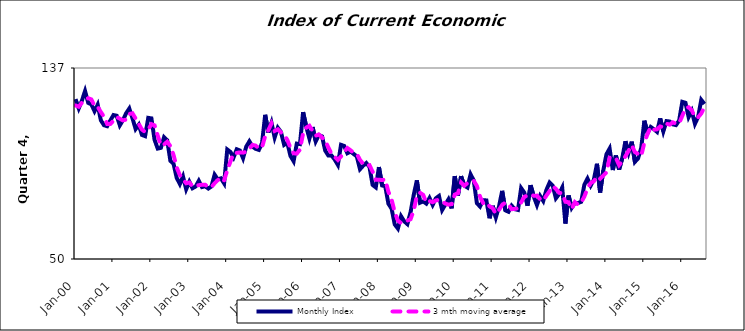
| Category | Monthly Index | 3 mth moving average |
|---|---|---|
| 2000-01-01 | 122.625 | 119.746 |
| 2000-02-01 | 118.415 | 119.165 |
| 2000-03-01 | 121.904 | 120.981 |
| 2000-04-01 | 126.291 | 122.203 |
| 2000-05-01 | 120.927 | 123.041 |
| 2000-06-01 | 120.243 | 122.487 |
| 2000-07-01 | 117.132 | 119.434 |
| 2000-08-01 | 120.087 | 119.154 |
| 2000-09-01 | 112.997 | 116.739 |
| 2000-10-01 | 110.759 | 114.614 |
| 2000-11-01 | 110.322 | 111.36 |
| 2000-12-01 | 112.924 | 111.335 |
| 2001-01-01 | 115.391 | 112.879 |
| 2001-02-01 | 115.085 | 114.466 |
| 2001-03-01 | 110.701 | 113.725 |
| 2001-04-01 | 113.07 | 112.952 |
| 2001-05-01 | 116.217 | 113.329 |
| 2001-06-01 | 118.363 | 115.883 |
| 2001-07-01 | 113.96 | 116.18 |
| 2001-08-01 | 109.042 | 113.788 |
| 2001-09-01 | 110.994 | 111.332 |
| 2001-10-01 | 106.361 | 108.799 |
| 2001-11-01 | 105.812 | 107.722 |
| 2001-12-01 | 114.107 | 108.76 |
| 2002-01-01 | 113.87 | 111.263 |
| 2002-02-01 | 104.113 | 110.697 |
| 2002-03-01 | 100.151 | 106.045 |
| 2002-04-01 | 100.503 | 101.589 |
| 2002-05-01 | 105.314 | 101.989 |
| 2002-06-01 | 103.927 | 103.248 |
| 2002-07-01 | 94.586 | 101.276 |
| 2002-08-01 | 93.281 | 97.265 |
| 2002-09-01 | 86.87 | 91.579 |
| 2002-10-01 | 84.038 | 88.063 |
| 2002-11-01 | 87.496 | 86.135 |
| 2002-12-01 | 81.703 | 84.412 |
| 2003-01-01 | 85.115 | 84.771 |
| 2003-02-01 | 82.145 | 82.988 |
| 2003-03-01 | 82.952 | 83.404 |
| 2003-04-01 | 85.542 | 83.546 |
| 2003-05-01 | 82.676 | 83.723 |
| 2003-06-01 | 83.048 | 83.755 |
| 2003-07-01 | 82.005 | 82.576 |
| 2003-08-01 | 82.967 | 82.673 |
| 2003-09-01 | 88.297 | 84.423 |
| 2003-10-01 | 86.186 | 85.817 |
| 2003-11-01 | 86.63 | 87.038 |
| 2003-12-01 | 84.367 | 85.728 |
| 2004-01-01 | 99.728 | 90.242 |
| 2004-02-01 | 98.638 | 94.244 |
| 2004-03-01 | 96.118 | 98.162 |
| 2004-04-01 | 99.845 | 98.201 |
| 2004-05-01 | 99.282 | 98.415 |
| 2004-06-01 | 95.798 | 98.308 |
| 2004-07-01 | 101.024 | 98.701 |
| 2004-08-01 | 103.451 | 100.091 |
| 2004-09-01 | 101.025 | 101.833 |
| 2004-10-01 | 100.027 | 101.501 |
| 2004-11-01 | 99.55 | 100.201 |
| 2004-12-01 | 102.586 | 100.721 |
| 2005-01-01 | 115.494 | 105.877 |
| 2005-02-01 | 107.464 | 108.515 |
| 2005-03-01 | 111.862 | 111.607 |
| 2005-04-01 | 105.202 | 108.176 |
| 2005-05-01 | 109.603 | 108.889 |
| 2005-06-01 | 107.689 | 107.498 |
| 2005-07-01 | 101.855 | 106.382 |
| 2005-08-01 | 102.825 | 104.123 |
| 2005-09-01 | 96.836 | 100.505 |
| 2005-10-01 | 94.419 | 98.027 |
| 2005-11-01 | 102.411 | 97.889 |
| 2005-12-01 | 102.19 | 99.673 |
| 2006-01-01 | 116.697 | 107.099 |
| 2006-02-01 | 110.105 | 109.664 |
| 2006-03-01 | 104.724 | 110.509 |
| 2006-04-01 | 109.919 | 108.249 |
| 2006-05-01 | 103.448 | 106.03 |
| 2006-06-01 | 106.305 | 106.557 |
| 2006-07-01 | 105.691 | 105.148 |
| 2006-08-01 | 99.249 | 103.748 |
| 2006-09-01 | 96.968 | 100.636 |
| 2006-10-01 | 96.994 | 97.737 |
| 2006-11-01 | 95.195 | 96.385 |
| 2006-12-01 | 92.759 | 94.983 |
| 2007-01-01 | 101.857 | 96.604 |
| 2007-02-01 | 101.359 | 98.658 |
| 2007-03-01 | 98.058 | 100.424 |
| 2007-04-01 | 98.812 | 99.409 |
| 2007-05-01 | 97.717 | 98.196 |
| 2007-06-01 | 96.607 | 97.712 |
| 2007-07-01 | 90.78 | 95.035 |
| 2007-08-01 | 92.373 | 93.253 |
| 2007-09-01 | 93.601 | 92.251 |
| 2007-10-01 | 91.814 | 92.596 |
| 2007-11-01 | 83.663 | 89.693 |
| 2007-12-01 | 82.543 | 86.007 |
| 2008-01-01 | 91.739 | 85.982 |
| 2008-02-01 | 83.4 | 85.894 |
| 2008-03-01 | 83.026 | 86.055 |
| 2008-04-01 | 75.099 | 80.509 |
| 2008-05-01 | 72.873 | 77 |
| 2008-06-01 | 65.708 | 71.227 |
| 2008-07-01 | 63.831 | 67.471 |
| 2008-08-01 | 69.423 | 66.321 |
| 2008-09-01 | 67.118 | 66.791 |
| 2008-10-01 | 65.853 | 67.465 |
| 2008-11-01 | 71.218 | 68.063 |
| 2008-12-01 | 79.045 | 72.039 |
| 2009-01-01 | 85.714 | 78.659 |
| 2009-02-01 | 75.564 | 80.108 |
| 2009-03-01 | 76.17 | 79.149 |
| 2009-04-01 | 75.15 | 75.628 |
| 2009-05-01 | 77.695 | 76.338 |
| 2009-06-01 | 74.567 | 75.804 |
| 2009-07-01 | 77.567 | 76.61 |
| 2009-08-01 | 78.623 | 76.919 |
| 2009-09-01 | 72.251 | 76.147 |
| 2009-10-01 | 74.711 | 75.195 |
| 2009-11-01 | 77.107 | 74.69 |
| 2009-12-01 | 73 | 74.939 |
| 2010-01-01 | 87.664 | 79.257 |
| 2010-02-01 | 78.828 | 79.831 |
| 2010-03-01 | 87.632 | 84.708 |
| 2010-04-01 | 83.368 | 83.276 |
| 2010-05-01 | 82.476 | 84.492 |
| 2010-06-01 | 88.448 | 84.764 |
| 2010-07-01 | 85.667 | 85.53 |
| 2010-08-01 | 75.33 | 83.148 |
| 2010-09-01 | 73.834 | 78.277 |
| 2010-10-01 | 76.727 | 75.297 |
| 2010-11-01 | 76.617 | 75.726 |
| 2010-12-01 | 68.497 | 73.947 |
| 2011-01-01 | 74.154 | 73.09 |
| 2011-02-01 | 68.927 | 70.526 |
| 2011-03-01 | 73.837 | 72.306 |
| 2011-04-01 | 80.952 | 74.572 |
| 2011-05-01 | 72.107 | 75.632 |
| 2011-06-01 | 71.459 | 74.839 |
| 2011-07-01 | 74.226 | 72.597 |
| 2011-08-01 | 72.63 | 72.772 |
| 2011-09-01 | 72.29 | 73.049 |
| 2011-10-01 | 82.204 | 75.708 |
| 2011-11-01 | 80.147 | 78.214 |
| 2011-12-01 | 74.201 | 78.851 |
| 2012-01-01 | 83.552 | 79.3 |
| 2012-02-01 | 78.322 | 78.692 |
| 2012-03-01 | 74.499 | 78.791 |
| 2012-04-01 | 78.652 | 77.158 |
| 2012-05-01 | 76.38 | 76.51 |
| 2012-06-01 | 81.402 | 78.811 |
| 2012-07-01 | 84.714 | 80.832 |
| 2012-08-01 | 83.25 | 83.122 |
| 2012-09-01 | 77.586 | 81.85 |
| 2012-10-01 | 79.468 | 80.101 |
| 2012-11-01 | 82.413 | 79.823 |
| 2012-12-01 | 66.11 | 75.997 |
| 2013-01-01 | 78.843 | 75.789 |
| 2013-02-01 | 73.235 | 72.73 |
| 2013-03-01 | 75.461 | 75.847 |
| 2013-04-01 | 75.429 | 74.708 |
| 2013-05-01 | 75.966 | 75.619 |
| 2013-06-01 | 83.724 | 78.373 |
| 2013-07-01 | 86.526 | 82.072 |
| 2013-08-01 | 83.309 | 84.52 |
| 2013-09-01 | 85.981 | 85.272 |
| 2013-10-01 | 93.254 | 87.515 |
| 2013-11-01 | 80.211 | 86.482 |
| 2013-12-01 | 90.256 | 87.907 |
| 2014-01-01 | 97.579 | 89.349 |
| 2014-02-01 | 100.154 | 95.997 |
| 2014-03-01 | 90.406 | 96.047 |
| 2014-04-01 | 97.007 | 95.856 |
| 2014-05-01 | 90.614 | 92.676 |
| 2014-06-01 | 95.788 | 94.469 |
| 2014-07-01 | 103.491 | 96.631 |
| 2014-08-01 | 98.277 | 99.185 |
| 2014-09-01 | 103.31 | 101.693 |
| 2014-10-01 | 94.126 | 98.571 |
| 2014-11-01 | 95.717 | 97.718 |
| 2014-12-01 | 100.418 | 96.754 |
| 2015-01-01 | 112.826 | 102.987 |
| 2015-02-01 | 107.183 | 106.809 |
| 2015-03-01 | 109.973 | 109.994 |
| 2015-04-01 | 108.992 | 108.716 |
| 2015-05-01 | 107.746 | 108.904 |
| 2015-06-01 | 113.879 | 110.206 |
| 2015-07-01 | 107.975 | 109.867 |
| 2015-08-01 | 112.636 | 111.497 |
| 2015-09-01 | 112.459 | 111.023 |
| 2015-10-01 | 111.15 | 112.082 |
| 2015-11-01 | 110.811 | 111.474 |
| 2015-12-01 | 112.902 | 111.621 |
| 2016-01-01 | 121.392 | 115.035 |
| 2016-02-01 | 120.953 | 118.416 |
| 2016-03-01 | 114.473 | 118.939 |
| 2016-04-01 | 117.26 | 117.562 |
| 2016-05-01 | 111.413 | 114.382 |
| 2016-06-01 | 114.502 | 114.392 |
| 2016-07-01 | 122.27 | 116.062 |
| 2016-08-01 | 120.414 | 119.062 |